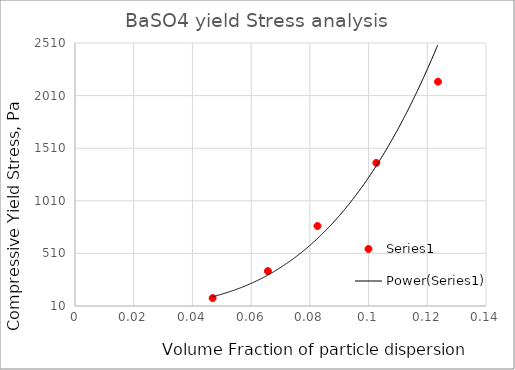
| Category | Series 0 |
|---|---|
| 0.046876554920371655 | 85.224 |
| 0.0657193960910486 | 341.81 |
| 0.08258969324777715 | 770.038 |
| 0.10264966026058346 | 1370.15 |
| 0.12365383448864874 | 2142.141 |